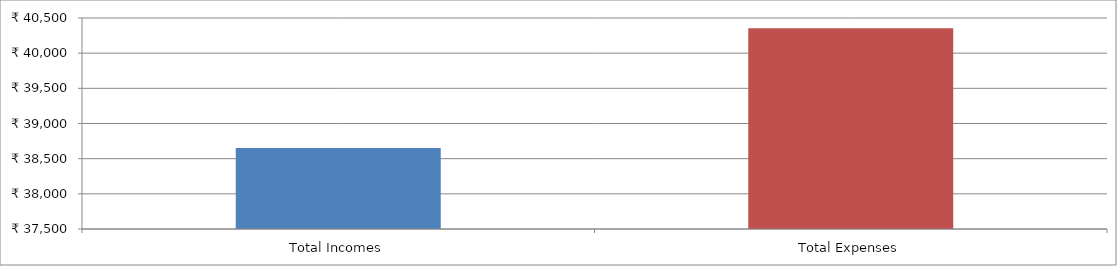
| Category | Series 0 |
|---|---|
| Total Incomes | 38650 |
| Total Expenses | 40355 |